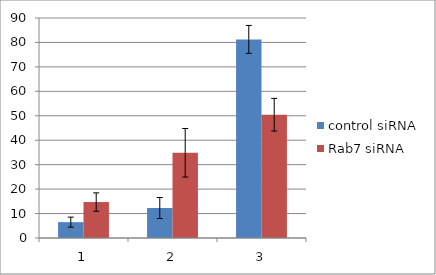
| Category | control siRNA | Rab7 siRNA |
|---|---|---|
| 0 | 6.483 | 14.714 |
| 1 | 12.266 | 34.854 |
| 2 | 81.251 | 50.433 |